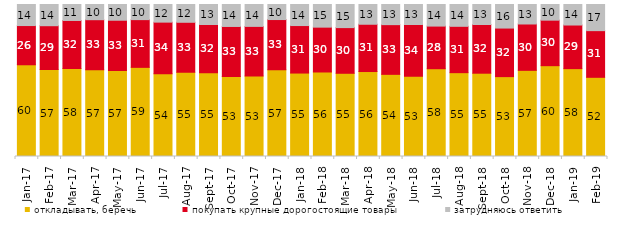
| Category | откладывать, беречь | покупать крупные дорогостоящие товары | затрудняюсь ответить |
|---|---|---|---|
| 2017-01-01 | 60.35 | 25.8 | 13.85 |
| 2017-02-01 | 56.8 | 28.6 | 13.85 |
| 2017-03-01 | 57.9 | 31.6 | 10.5 |
| 2017-04-01 | 57.1 | 32.85 | 10 |
| 2017-05-01 | 56.6 | 33.05 | 10.35 |
| 2017-06-01 | 58.65 | 31.4 | 9.95 |
| 2017-07-01 | 54.4 | 34 | 11.6 |
| 2017-08-01 | 55.4 | 32.9 | 11.7 |
| 2017-09-01 | 55.1 | 31.75 | 13.15 |
| 2017-10-01 | 52.6 | 32.95 | 14.45 |
| 2017-11-01 | 52.9 | 32.7 | 14.4 |
| 2017-12-01 | 57.1 | 33 | 9.9 |
| 2018-01-01 | 54.9 | 31.25 | 13.85 |
| 2018-02-01 | 55.6 | 29.5 | 14.9 |
| 2018-03-01 | 54.75 | 30.05 | 15.2 |
| 2018-04-01 | 55.9 | 31.1 | 13 |
| 2018-05-01 | 54.05 | 32.7 | 13.25 |
| 2018-06-01 | 52.85 | 34 | 13.15 |
| 2018-07-01 | 57.75 | 28.05 | 14.2 |
| 2018-08-01 | 55.15 | 30.5 | 14.35 |
| 2018-09-01 | 54.8 | 32.05 | 13.15 |
| 2018-10-01 | 52.55 | 31.95 | 15.5 |
| 2018-11-01 | 56.687 | 30.489 | 12.824 |
| 2018-12-01 | 59.75 | 29.95 | 10.3 |
| 2019-01-01 | 57.8 | 28.7 | 13.5 |
| 2019-02-01 | 52.1 | 30.7 | 17.2 |